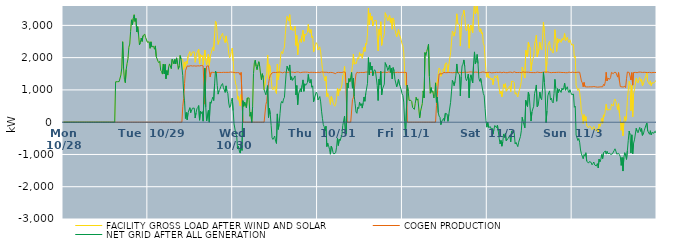
| Category | FACILITY GROSS LOAD AFTER WIND AND SOLAR | COGEN PRODUCTION | NET GRID AFTER ALL GENERATION |
|---|---|---|---|
|  Mon  10/28 | 0 | 0 | 0 |
|  Mon  10/28 | 0 | 0 | 0 |
|  Mon  10/28 | 0 | 0 | 0 |
|  Mon  10/28 | 0 | 0 | 0 |
|  Mon  10/28 | 0 | 0 | 0 |
|  Mon  10/28 | 0 | 0 | 0 |
|  Mon  10/28 | 0 | 0 | 0 |
|  Mon  10/28 | 0 | 0 | 0 |
|  Mon  10/28 | 0 | 0 | 0 |
|  Mon  10/28 | 0 | 0 | 0 |
|  Mon  10/28 | 0 | 0 | 0 |
|  Mon  10/28 | 0 | 0 | 0 |
|  Mon  10/28 | 0 | 0 | 0 |
|  Mon  10/28 | 0 | 0 | 0 |
|  Mon  10/28 | 0 | 0 | 0 |
|  Mon  10/28 | 0 | 0 | 0 |
|  Mon  10/28 | 0 | 0 | 0 |
|  Mon  10/28 | 0 | 0 | 0 |
|  Mon  10/28 | 0 | 0 | 0 |
|  Mon  10/28 | 0 | 0 | 0 |
|  Mon  10/28 | 0 | 0 | 0 |
|  Mon  10/28 | 0 | 0 | 0 |
|  Mon  10/28 | 0 | 0 | 0 |
|  Mon  10/28 | 0 | 0 | 0 |
|  Mon  10/28 | 0 | 0 | 0 |
|  Mon  10/28 | 0 | 0 | 0 |
|  Mon  10/28 | 0 | 0 | 0 |
|  Mon  10/28 | 0 | 0 | 0 |
|  Mon  10/28 | 0 | 0 | 0 |
|  Mon  10/28 | 0 | 0 | 0 |
|  Mon  10/28 | 0 | 0 | 0 |
|  Mon  10/28 | 0 | 0 | 0 |
|  Mon  10/28 | 0 | 0 | 0 |
|  Mon  10/28 | 0 | 0 | 0 |
|  Mon  10/28 | 0 | 0 | 0 |
|  Mon  10/28 | 0 | 0 | 0 |
|  Mon  10/28 | 0 | 0 | 0 |
|  Mon  10/28 | 0 | 0 | 0 |
|  Mon  10/28 | 0 | 0 | 0 |
|  Mon  10/28 | 0 | 0 | 0 |
|  Mon  10/28 | 0 | 0 | 0 |
|  Mon  10/28 | 0 | 0 | 0 |
|  Mon  10/28 | 0 | 0 | 0 |
|  Mon  10/28 | 0 | 0 | 0 |
|  Mon  10/28 | 0 | 0 | 0 |
|  Mon  10/28 | 0 | 0 | 0 |
|  Mon  10/28 | 0 | 0 | 0 |
|  Mon  10/28 | 0 | 0 | 0 |
|  Mon  10/28 | 0 | 0 | 0 |
|  Mon  10/28 | 0 | 0 | 0 |
|  Mon  10/28 | 0 | 0 | 0 |
|  Mon  10/28 | 0 | 0 | 0 |
|  Mon  10/28 | 0 | 0 | 0 |
|  Mon  10/28 | 0 | 0 | 0 |
|  Mon  10/28 | 0 | 0 | 0 |
|  Mon  10/28 | 0 | 0 | 0 |
|  Mon  10/28 | 0 | 0 | 0 |
|  Mon  10/28 | 0 | 0 | 0 |
|  Mon  10/28 | 0 | 0 | 0 |
|  Mon  10/28 | 1250.69 | 0 | 1250.69 |
|  Mon  10/28 | 1252.668 | 0 | 1252.668 |
|  Mon  10/28 | 1254.647 | 0 | 1254.647 |
|  Mon  10/28 | 1256.625 | 0 | 1256.625 |
|  Mon  10/28 | 1258.603 | 0 | 1258.603 |
|  Mon  10/28 | 1260.581 | 0 | 1260.581 |
|  Mon  10/28 | 1464 | 0 | 1464 |
|  Mon  10/28 | 1678 | 0 | 1678 |
|  Mon  10/28 | 2492 | 0 | 2492 |
|  Mon  10/28 | 1679 | 0 | 1679 |
|  Mon  10/28 | 1330 | 0 | 1330 |
|  Mon  10/28 | 1225 | 0 | 1225 |
|  Mon  10/28 | 1632 | 0 | 1632 |
|  Mon  10/28 | 1819 | 0 | 1819 |
|  Mon  10/28 | 1964 | 0 | 1964 |
|  Mon  10/28 | 2321 | 0 | 2321 |
|  Mon  10/28 | 2421 | 0 | 2421 |
|  Mon  10/28 | 2817 | 0 | 2817 |
|  Mon  10/28 | 3172 | 0 | 3172 |
|  Mon  10/28 | 3016 | 0 | 3016 |
|  Mon  10/28 | 3217 | 0 | 3217 |
|  Mon  10/28 | 3328 | 0 | 3328 |
|  Mon  10/28 | 3123 | 0 | 3123 |
|  Mon  10/28 | 3212 | 0 | 3212 |
|  Mon  10/28 | 2795 | 0 | 2795 |
|  Mon  10/28 | 2959 | 0 | 2959 |
|  Mon  10/28 | 2708 | 0 | 2708 |
|  Mon  10/28 | 2396 | 0 | 2396 |
|  Mon  10/28 | 2468 | 0 | 2468 |
|  Mon  10/28 | 2608 | 0 | 2608 |
|  Mon  10/28 | 2502 | 0 | 2502 |
|  Mon  10/28 | 2678 | 0 | 2678 |
|  Mon  10/28 | 2668 | 0 | 2668 |
|  Mon  10/28 | 2727 | 0 | 2727 |
|  Mon  10/28 | 2619 | 0 | 2619 |
|  Mon  10/28 | 2647 | 0 | 2647 |
|  Mon  10/28 | 2477 | 0 | 2477 |
|  Tue  10/29 | 2494 | 0 | 2494 |
|  Tue  10/29 | 2489 | 0 | 2489 |
|  Tue  10/29 | 2289 | 0 | 2289 |
|  Tue  10/29 | 2490 | 0 | 2490 |
|  Tue  10/29 | 2333 | 0 | 2333 |
|  Tue  10/29 | 2355 | 0 | 2355 |
|  Tue  10/29 | 2350 | 0 | 2350 |
|  Tue  10/29 | 2260 | 0 | 2260 |
|  Tue  10/29 | 2363 | 0 | 2363 |
|  Tue  10/29 | 2029 | 0 | 2029 |
|  Tue  10/29 | 2006 | 0 | 2006 |
|  Tue  10/29 | 1885 | 0 | 1885 |
|  Tue  10/29 | 1843 | 0 | 1843 |
|  Tue  10/29 | 1887 | 0 | 1887 |
|  Tue  10/29 | 1609 | 0 | 1609 |
|  Tue  10/29 | 1569 | 0 | 1569 |
|  Tue  10/29 | 1491 | 0 | 1491 |
|  Tue  10/29 | 1799 | 0 | 1799 |
|  Tue  10/29 | 1496 | 0 | 1496 |
|  Tue  10/29 | 1792 | 0 | 1792 |
|  Tue  10/29 | 1344 | 0 | 1344 |
|  Tue  10/29 | 1599 | 0 | 1599 |
|  Tue  10/29 | 1460 | 0 | 1460 |
|  Tue  10/29 | 1702 | 0 | 1702 |
|  Tue  10/29 | 1806 | 0 | 1806 |
|  Tue  10/29 | 1835 | 0 | 1835 |
|  Tue  10/29 | 1660 | 0 | 1660 |
|  Tue  10/29 | 1951 | 0 | 1951 |
|  Tue  10/29 | 1907 | 0 | 1907 |
|  Tue  10/29 | 1805 | 0 | 1805 |
|  Tue  10/29 | 1944 | 0 | 1944 |
|  Tue  10/29 | 1803 | 0 | 1803 |
|  Tue  10/29 | 1992 | 0 | 1992 |
|  Tue  10/29 | 1834 | 0 | 1834 |
|  Tue  10/29 | 1642 | 0 | 1642 |
|  Tue  10/29 | 1744 | 0 | 1744 |
|  Tue  10/29 | 2065 | 0 | 2065 |
|  Tue  10/29 | 1953 | 0 | 1953 |
|  Tue  10/29 | 1929 | 0 | 1929 |
|  Tue  10/29 | 1933 | 489 | 1444 |
|  Tue  10/29 | 1636 | 735 | 901 |
|  Tue  10/29 | 1860 | 1198 | 662 |
|  Tue  10/29 | 1705 | 1590 | 115 |
|  Tue  10/29 | 1895 | 1595 | 300 |
|  Tue  10/29 | 1816 | 1742 | 74 |
|  Tue  10/29 | 2051 | 1756 | 295 |
|  Tue  10/29 | 2027 | 1734 | 293 |
|  Tue  10/29 | 2186 | 1737 | 449 |
|  Tue  10/29 | 2044 | 1751 | 293 |
|  Tue  10/29 | 2050 | 1740 | 310 |
|  Tue  10/29 | 2173 | 1739 | 434 |
|  Tue  10/29 | 2172 | 1743 | 429 |
|  Tue  10/29 | 2182 | 1746 | 436 |
|  Tue  10/29 | 1855 | 1726 | 129 |
|  Tue  10/29 | 2025 | 1737 | 288 |
|  Tue  10/29 | 2149 | 1732 | 417 |
|  Tue  10/29 | 2203 | 1747 | 456 |
|  Tue  10/29 | 2267 | 1752 | 515 |
|  Tue  10/29 | 1802 | 1742 | 60 |
|  Tue  10/29 | 2095 | 1760 | 335 |
|  Tue  10/29 | 2027 | 1756 | 271 |
|  Tue  10/29 | 2067 | 1739 | 328 |
|  Tue  10/29 | 1775 | 1745 | 30 |
|  Tue  10/29 | 1770 | 1753 | 17 |
|  Tue  10/29 | 2231 | 559 | 1672 |
|  Tue  10/29 | 1923 | 1451 | 472 |
|  Tue  10/29 | 1774 | 1737 | 37 |
|  Tue  10/29 | 1799 | 1757 | 42 |
|  Tue  10/29 | 2109 | 1747 | 362 |
|  Tue  10/29 | 1754 | 1753 | 1 |
|  Tue  10/29 | 2029 | 1401 | 628 |
|  Tue  10/29 | 2128 | 1544 | 584 |
|  Tue  10/29 | 2241 | 1547 | 694 |
|  Tue  10/29 | 2320 | 1544 | 776 |
|  Tue  10/29 | 2215 | 1545 | 670 |
|  Tue  10/29 | 2725 | 1539 | 1186 |
|  Tue  10/29 | 3131 | 1547 | 1584 |
|  Tue  10/29 | 3054 | 1539 | 1515 |
|  Tue  10/29 | 2700 | 1559 | 1141 |
|  Tue  10/29 | 2410 | 1541 | 869 |
|  Tue  10/29 | 2518 | 1545 | 973 |
|  Tue  10/29 | 2560 | 1541 | 1019 |
|  Tue  10/29 | 2643 | 1539 | 1104 |
|  Tue  10/29 | 2702 | 1539 | 1163 |
|  Tue  10/29 | 2756 | 1559 | 1197 |
|  Tue  10/29 | 2614 | 1545 | 1069 |
|  Tue  10/29 | 2623 | 1552 | 1071 |
|  Tue  10/29 | 2464 | 1542 | 922 |
|  Tue  10/29 | 2672 | 1547 | 1125 |
|  Tue  10/29 | 2498 | 1544 | 954 |
|  Tue  10/29 | 2434 | 1549 | 885 |
|  Tue  10/29 | 2136 | 1542 | 594 |
|  Tue  10/29 | 2000 | 1546 | 454 |
|  Tue  10/29 | 2046 | 1553 | 493 |
|  Tue  10/29 | 2191 | 1548 | 643 |
|  Tue  10/29 | 2297 | 1549 | 748 |
|  Wed  10/30 | 1897 | 1540 | 357 |
|  Wed  10/30 | 1490 | 1543 | -53 |
|  Wed  10/30 | 1494 | 1542 | -48 |
|  Wed  10/30 | 1172 | 1532 | -360 |
|  Wed  10/30 | 1110 | 1540 | -430 |
|  Wed  10/30 | 711 | 1537 | -826 |
|  Wed  10/30 | 799 | 1548 | -749 |
|  Wed  10/30 | 634 | 1528 | -894 |
|  Wed  10/30 | 501 | 1459 | -958 |
|  Wed  10/30 | 855 | 1542 | -687 |
|  Wed  10/30 | 673 | 1548 | -875 |
|  Wed  10/30 | 667 | 0 | 667 |
|  Wed  10/30 | 492 | 0 | 492 |
|  Wed  10/30 | 624 | 0 | 624 |
|  Wed  10/30 | 518 | 0 | 518 |
|  Wed  10/30 | 444 | 0 | 444 |
|  Wed  10/30 | 750 | 0 | 750 |
|  Wed  10/30 | 768 | 0 | 768 |
|  Wed  10/30 | 751 | 0 | 751 |
|  Wed  10/30 | 184 | 0 | 184 |
|  Wed  10/30 | 306 | 0 | 306 |
|  Wed  10/30 | -13 | 0 | -13 |
|  Wed  10/30 | 480 | 0 | 480 |
|  Wed  10/30 | 1505 | 0 | 1505 |
|  Wed  10/30 | 1840 | 0 | 1840 |
|  Wed  10/30 | 1920 | 0 | 1920 |
|  Wed  10/30 | 1736 | 0 | 1736 |
|  Wed  10/30 | 1628 | 0 | 1628 |
|  Wed  10/30 | 1775 | 0 | 1775 |
|  Wed  10/30 | 1873 | 0 | 1873 |
|  Wed  10/30 | 1734 | 0 | 1734 |
|  Wed  10/30 | 1495 | 0 | 1495 |
|  Wed  10/30 | 1309 | 0 | 1309 |
|  Wed  10/30 | 1502 | 0 | 1502 |
|  Wed  10/30 | 1384 | 0 | 1384 |
|  Wed  10/30 | 1005 | 0 | 1005 |
|  Wed  10/30 | 1014 | 0 | 1014 |
|  Wed  10/30 | 1395 | 547 | 848 |
|  Wed  10/30 | 1506 | 648 | 858 |
|  Wed  10/30 | 2082 | 949 | 1133 |
|  Wed  10/30 | 1337 | 1192 | 145 |
|  Wed  10/30 | 1783 | 1353 | 430 |
|  Wed  10/30 | 1691 | 1452 | 239 |
|  Wed  10/30 | 1345 | 1453 | -108 |
|  Wed  10/30 | 1043 | 1528 | -485 |
|  Wed  10/30 | 1005 | 1540 | -535 |
|  Wed  10/30 | 1062 | 1543 | -481 |
|  Wed  10/30 | 1109 | 1538 | -429 |
|  Wed  10/30 | 948 | 1539 | -591 |
|  Wed  10/30 | 887 | 1547 | -660 |
|  Wed  10/30 | 1800 | 1544 | 256 |
|  Wed  10/30 | 1309 | 1534 | -225 |
|  Wed  10/30 | 1489 | 1552 | -63 |
|  Wed  10/30 | 1809 | 1545 | 264 |
|  Wed  10/30 | 2128 | 1548 | 580 |
|  Wed  10/30 | 2188 | 1544 | 644 |
|  Wed  10/30 | 2120 | 1529 | 591 |
|  Wed  10/30 | 2251 | 1533 | 718 |
|  Wed  10/30 | 2321 | 1553 | 768 |
|  Wed  10/30 | 2711 | 1556 | 1155 |
|  Wed  10/30 | 3068 | 1539 | 1529 |
|  Wed  10/30 | 3279 | 1544 | 1735 |
|  Wed  10/30 | 3269 | 1544 | 1725 |
|  Wed  10/30 | 3138 | 1541 | 1597 |
|  Wed  10/30 | 3329 | 1555 | 1774 |
|  Wed  10/30 | 2866 | 1554 | 1312 |
|  Wed  10/30 | 2957 | 1550 | 1407 |
|  Wed  10/30 | 2847 | 1551 | 1296 |
|  Wed  10/30 | 2876 | 1548 | 1328 |
|  Wed  10/30 | 2863 | 1526 | 1337 |
|  Wed  10/30 | 2971 | 1538 | 1433 |
|  Wed  10/30 | 2377 | 1533 | 844 |
|  Wed  10/30 | 2691 | 1555 | 1136 |
|  Wed  10/30 | 2092 | 1552 | 540 |
|  Wed  10/30 | 2426 | 1552 | 874 |
|  Wed  10/30 | 2401 | 1541 | 860 |
|  Wed  10/30 | 2577 | 1535 | 1042 |
|  Wed  10/30 | 2474 | 1539 | 935 |
|  Wed  10/30 | 2688 | 1545 | 1143 |
|  Wed  10/30 | 2849 | 1539 | 1310 |
|  Wed  10/30 | 2506 | 1550 | 956 |
|  Wed  10/30 | 2727 | 1537 | 1190 |
|  Wed  10/30 | 2693 | 1550 | 1143 |
|  Wed  10/30 | 2723 | 1546 | 1177 |
|  Wed  10/30 | 2778 | 1548 | 1230 |
|  Wed  10/30 | 3030 | 1551 | 1479 |
|  Wed  10/30 | 2799 | 1537 | 1262 |
|  Wed  10/30 | 2759 | 1546 | 1213 |
|  Wed  10/30 | 2873 | 1547 | 1326 |
|  Wed  10/30 | 2620 | 1537 | 1083 |
|  Wed  10/30 | 2668 | 1543 | 1125 |
|  Wed  10/30 | 2177 | 1544 | 633 |
|  Wed  10/30 | 2294 | 1543 | 751 |
|  Wed  10/30 | 2291 | 1542 | 749 |
|  Wed  10/30 | 2465 | 1536 | 929 |
|  Wed  10/30 | 2417 | 1538 | 879 |
|  Thu  10/31 | 2235 | 1548 | 687 |
|  Thu  10/31 | 2232 | 1551 | 681 |
|  Thu  10/31 | 2335 | 1540 | 795 |
|  Thu  10/31 | 2177 | 1548 | 629 |
|  Thu  10/31 | 1894 | 1553 | 341 |
|  Thu  10/31 | 1661 | 1541 | 120 |
|  Thu  10/31 | 1473 | 1550 | -77 |
|  Thu  10/31 | 1394 | 1536 | -142 |
|  Thu  10/31 | 1276 | 1546 | -270 |
|  Thu  10/31 | 1419 | 1546 | -127 |
|  Thu  10/31 | 791 | 1546 | -755 |
|  Thu  10/31 | 892 | 1540 | -648 |
|  Thu  10/31 | 799 | 1534 | -735 |
|  Thu  10/31 | 706 | 1546 | -840 |
|  Thu  10/31 | 550 | 1542 | -992 |
|  Thu  10/31 | 793 | 1536 | -743 |
|  Thu  10/31 | 719 | 1539 | -820 |
|  Thu  10/31 | 603 | 1541 | -938 |
|  Thu  10/31 | 538 | 1523 | -985 |
|  Thu  10/31 | 494 | 1506 | -1012 |
|  Thu  10/31 | 558 | 1502 | -944 |
|  Thu  10/31 | 762 | 1537 | -775 |
|  Thu  10/31 | 1053 | 1551 | -498 |
|  Thu  10/31 | 822 | 1544 | -722 |
|  Thu  10/31 | 1031 | 1561 | -530 |
|  Thu  10/31 | 969 | 1541 | -572 |
|  Thu  10/31 | 981 | 1534 | -553 |
|  Thu  10/31 | 1149 | 1540 | -391 |
|  Thu  10/31 | 1447 | 1550 | -103 |
|  Thu  10/31 | 1483 | 1556 | -73 |
|  Thu  10/31 | 1729 | 1540 | 189 |
|  Thu  10/31 | 1254 | 1547 | -293 |
|  Thu  10/31 | 1172 | 1532 | -360 |
|  Thu  10/31 | 1215 | 0 | 1215 |
|  Thu  10/31 | 1062 | 0 | 1062 |
|  Thu  10/31 | 1351 | 0 | 1351 |
|  Thu  10/31 | 1259 | 0 | 1259 |
|  Thu  10/31 | 1381 | 0 | 1381 |
|  Thu  10/31 | 1539 | 0 | 1539 |
|  Thu  10/31 | 1757 | 703 | 1054 |
|  Thu  10/31 | 2112 | 754 | 1358 |
|  Thu  10/31 | 1795 | 996 | 799 |
|  Thu  10/31 | 1847 | 1275 | 572 |
|  Thu  10/31 | 1807 | 1493 | 314 |
|  Thu  10/31 | 1821 | 1546 | 275 |
|  Thu  10/31 | 2002 | 1537 | 465 |
|  Thu  10/31 | 1954 | 1532 | 422 |
|  Thu  10/31 | 2156 | 1539 | 617 |
|  Thu  10/31 | 2059 | 1540 | 519 |
|  Thu  10/31 | 2116 | 1544 | 572 |
|  Thu  10/31 | 1977 | 1540 | 437 |
|  Thu  10/31 | 2132 | 1542 | 590 |
|  Thu  10/31 | 2317 | 1538 | 779 |
|  Thu  10/31 | 2191 | 1543 | 648 |
|  Thu  10/31 | 2442 | 1551 | 891 |
|  Thu  10/31 | 2409 | 1535 | 874 |
|  Thu  10/31 | 2757 | 1553 | 1204 |
|  Thu  10/31 | 3534 | 1533 | 2001 |
|  Thu  10/31 | 3016 | 1548 | 1468 |
|  Thu  10/31 | 3384 | 1536 | 1848 |
|  Thu  10/31 | 3165 | 1543 | 1622 |
|  Thu  10/31 | 3277 | 1538 | 1739 |
|  Thu  10/31 | 2989 | 1548 | 1441 |
|  Thu  10/31 | 3099 | 1532 | 1567 |
|  Thu  10/31 | 3156 | 1530 | 1626 |
|  Thu  10/31 | 3127 | 1545 | 1582 |
|  Thu  10/31 | 3151 | 1543 | 1608 |
|  Thu  10/31 | 2667 | 1536 | 1131 |
|  Thu  10/31 | 2214 | 1543 | 671 |
|  Thu  10/31 | 2880 | 1544 | 1336 |
|  Thu  10/31 | 2696 | 1539 | 1157 |
|  Thu  10/31 | 3111 | 1538 | 1573 |
|  Thu  10/31 | 2381 | 1537 | 844 |
|  Thu  10/31 | 2572 | 1538 | 1034 |
|  Thu  10/31 | 2599 | 1548 | 1051 |
|  Thu  10/31 | 2715 | 1537 | 1178 |
|  Thu  10/31 | 3392 | 1547 | 1845 |
|  Thu  10/31 | 3413 | 1542 | 1871 |
|  Thu  10/31 | 3244 | 1538 | 1706 |
|  Thu  10/31 | 3144 | 1544 | 1600 |
|  Thu  10/31 | 3241 | 1558 | 1683 |
|  Thu  10/31 | 3308 | 1538 | 1770 |
|  Thu  10/31 | 3085 | 1539 | 1546 |
|  Thu  10/31 | 3215 | 1546 | 1669 |
|  Thu  10/31 | 2880 | 1540 | 1340 |
|  Thu  10/31 | 3230 | 1539 | 1691 |
|  Thu  10/31 | 3138 | 1541 | 1597 |
|  Thu  10/31 | 2871 | 1541 | 1330 |
|  Thu  10/31 | 2863 | 1540 | 1323 |
|  Thu  10/31 | 2647 | 1550 | 1097 |
|  Thu  10/31 | 2752 | 1546 | 1206 |
|  Thu  10/31 | 2873 | 1540 | 1333 |
|  Thu  10/31 | 2725 | 1541 | 1184 |
|  Thu  10/31 | 2647 | 1543 | 1104 |
|  Thu  10/31 | 2556 | 1542 | 1014 |
|  Thu  10/31 | 2428 | 1544 | 884 |
|  Fri  11/1 | 2370 | 1545 | 825 |
|  Fri  11/1 | 2168 | 1545 | 623 |
|  Fri  11/1 | 1554 | 1542 | 12 |
|  Fri  11/1 | 1145 | 1545 | -400 |
|  Fri  11/1 | 1159 | 1539 | -380 |
|  Fri  11/1 | 1149 | 0 | 1149 |
|  Fri  11/1 | 967 | 0 | 967 |
|  Fri  11/1 | 675 | 0 | 675 |
|  Fri  11/1 | 692 | 0 | 692 |
|  Fri  11/1 | 677 | 0 | 677 |
|  Fri  11/1 | 641 | 0 | 641 |
|  Fri  11/1 | 456 | 0 | 456 |
|  Fri  11/1 | 472 | 0 | 472 |
|  Fri  11/1 | 396 | 0 | 396 |
|  Fri  11/1 | 576 | 0 | 576 |
|  Fri  11/1 | 769 | 0 | 769 |
|  Fri  11/1 | 682 | 0 | 682 |
|  Fri  11/1 | 724 | 0 | 724 |
|  Fri  11/1 | 718 | 0 | 718 |
|  Fri  11/1 | 134 | 0 | 134 |
|  Fri  11/1 | 337 | 0 | 337 |
|  Fri  11/1 | 329 | 0 | 329 |
|  Fri  11/1 | 576 | 0 | 576 |
|  Fri  11/1 | 968 | 0 | 968 |
|  Fri  11/1 | 752 | 0 | 752 |
|  Fri  11/1 | 2155 | 0 | 2155 |
|  Fri  11/1 | 2071 | 0 | 2071 |
|  Fri  11/1 | 2187 | 0 | 2187 |
|  Fri  11/1 | 2295 | 0 | 2295 |
|  Fri  11/1 | 2417 | 0 | 2417 |
|  Fri  11/1 | 1418 | 0 | 1418 |
|  Fri  11/1 | 896 | 0 | 896 |
|  Fri  11/1 | 1070 | 0 | 1070 |
|  Fri  11/1 | 926 | 0 | 926 |
|  Fri  11/1 | 957 | 0 | 957 |
|  Fri  11/1 | 749 | 0 | 749 |
|  Fri  11/1 | 797 | 0 | 797 |
|  Fri  11/1 | 1218 | 0 | 1218 |
|  Fri  11/1 | 1125 | 511 | 614 |
|  Fri  11/1 | 1262 | 486 | 776 |
|  Fri  11/1 | 1504 | 1210 | 294 |
|  Fri  11/1 | 1680 | 1493 | 187 |
|  Fri  11/1 | 1636 | 1487 | 149 |
|  Fri  11/1 | 1422 | 1499 | -77 |
|  Fri  11/1 | 1519 | 1491 | 28 |
|  Fri  11/1 | 1571 | 1499 | 72 |
|  Fri  11/1 | 1662 | 1544 | 118 |
|  Fri  11/1 | 1566 | 1535 | 31 |
|  Fri  11/1 | 1810 | 1535 | 275 |
|  Fri  11/1 | 1843 | 1550 | 293 |
|  Fri  11/1 | 1786 | 1535 | 251 |
|  Fri  11/1 | 1556 | 1530 | 26 |
|  Fri  11/1 | 1784 | 1542 | 242 |
|  Fri  11/1 | 1809 | 1547 | 262 |
|  Fri  11/1 | 2151 | 1537 | 614 |
|  Fri  11/1 | 2480 | 1540 | 940 |
|  Fri  11/1 | 2826 | 1533 | 1293 |
|  Fri  11/1 | 2769 | 1541 | 1228 |
|  Fri  11/1 | 2667 | 1536 | 1131 |
|  Fri  11/1 | 2800 | 1538 | 1262 |
|  Fri  11/1 | 3000 | 1544 | 1456 |
|  Fri  11/1 | 3357 | 1553 | 1804 |
|  Fri  11/1 | 3058 | 1535 | 1523 |
|  Fri  11/1 | 3063 | 1545 | 1518 |
|  Fri  11/1 | 3023 | 1548 | 1475 |
|  Fri  11/1 | 2359 | 1544 | 815 |
|  Fri  11/1 | 2952 | 1538 | 1414 |
|  Fri  11/1 | 3290 | 1546 | 1744 |
|  Fri  11/1 | 3339 | 1541 | 1798 |
|  Fri  11/1 | 3471 | 1542 | 1929 |
|  Fri  11/1 | 3274 | 1549 | 1725 |
|  Fri  11/1 | 2902 | 1544 | 1358 |
|  Fri  11/1 | 2831 | 1544 | 1287 |
|  Fri  11/1 | 2904 | 1541 | 1363 |
|  Fri  11/1 | 3038 | 1547 | 1491 |
|  Fri  11/1 | 2292 | 1537 | 755 |
|  Fri  11/1 | 2914 | 1557 | 1357 |
|  Fri  11/1 | 3011 | 1543 | 1468 |
|  Fri  11/1 | 3001 | 1553 | 1448 |
|  Fri  11/1 | 2772 | 1552 | 1220 |
|  Fri  11/1 | 3363 | 1544 | 1819 |
|  Fri  11/1 | 3714 | 1536 | 2178 |
|  Fri  11/1 | 3352 | 1550 | 1802 |
|  Fri  11/1 | 3439 | 1538 | 1901 |
|  Fri  11/1 | 3649 | 1549 | 2100 |
|  Fri  11/1 | 3354 | 1539 | 1815 |
|  Fri  11/1 | 2890 | 1529 | 1361 |
|  Fri  11/1 | 2799 | 1533 | 1266 |
|  Fri  11/1 | 2897 | 1541 | 1356 |
|  Fri  11/1 | 2740 | 1543 | 1197 |
|  Fri  11/1 | 2776 | 1554 | 1222 |
|  Fri  11/1 | 2440 | 1549 | 891 |
|  Fri  11/1 | 2372 | 1552 | 820 |
|  Fri  11/1 | 1975 | 1545 | 430 |
|  Fri  11/1 | 1587 | 1531 | 56 |
|  Fri  11/1 | 1391 | 1545 | -154 |
|  Sat  11/2 | 1539 | 1542 | -3 |
|  Sat  11/2 | 1367 | 1530 | -163 |
|  Sat  11/2 | 1408 | 1548 | -140 |
|  Sat  11/2 | 1389 | 1529 | -140 |
|  Sat  11/2 | 1309 | 1530 | -221 |
|  Sat  11/2 | 1366 | 1549 | -183 |
|  Sat  11/2 | 1160 | 1532 | -372 |
|  Sat  11/2 | 1319 | 1544 | -225 |
|  Sat  11/2 | 1436 | 1538 | -102 |
|  Sat  11/2 | 1443 | 1534 | -91 |
|  Sat  11/2 | 1374 | 1545 | -171 |
|  Sat  11/2 | 1445 | 1536 | -91 |
|  Sat  11/2 | 1250 | 1540 | -290 |
|  Sat  11/2 | 1038 | 1549 | -511 |
|  Sat  11/2 | 876 | 1550 | -674 |
|  Sat  11/2 | 963 | 1528 | -565 |
|  Sat  11/2 | 788 | 1532 | -744 |
|  Sat  11/2 | 935 | 1545 | -610 |
|  Sat  11/2 | 1184 | 1549 | -365 |
|  Sat  11/2 | 1083 | 1539 | -456 |
|  Sat  11/2 | 1192 | 1537 | -345 |
|  Sat  11/2 | 957 | 1538 | -581 |
|  Sat  11/2 | 928 | 1533 | -605 |
|  Sat  11/2 | 1031 | 1533 | -502 |
|  Sat  11/2 | 1028 | 1548 | -520 |
|  Sat  11/2 | 1123 | 1540 | -417 |
|  Sat  11/2 | 939 | 1550 | -611 |
|  Sat  11/2 | 1270 | 1546 | -276 |
|  Sat  11/2 | 1282 | 1535 | -253 |
|  Sat  11/2 | 1260 | 1542 | -282 |
|  Sat  11/2 | 1224 | 1561 | -337 |
|  Sat  11/2 | 867 | 1541 | -674 |
|  Sat  11/2 | 913 | 1538 | -625 |
|  Sat  11/2 | 922 | 1545 | -623 |
|  Sat  11/2 | 781 | 1539 | -758 |
|  Sat  11/2 | 921 | 1542 | -621 |
|  Sat  11/2 | 910 | 1542 | -632 |
|  Sat  11/2 | 1105 | 1549 | -444 |
|  Sat  11/2 | 1269 | 1535 | -266 |
|  Sat  11/2 | 1706 | 1555 | 151 |
|  Sat  11/2 | 1582 | 1559 | 23 |
|  Sat  11/2 | 1582 | 1545 | 37 |
|  Sat  11/2 | 1369 | 1545 | -176 |
|  Sat  11/2 | 2233 | 1554 | 679 |
|  Sat  11/2 | 2214 | 1550 | 664 |
|  Sat  11/2 | 2024 | 1540 | 484 |
|  Sat  11/2 | 2478 | 1548 | 930 |
|  Sat  11/2 | 2358 | 1549 | 809 |
|  Sat  11/2 | 2323 | 1541 | 782 |
|  Sat  11/2 | 1587 | 1552 | 35 |
|  Sat  11/2 | 1854 | 1537 | 317 |
|  Sat  11/2 | 1952 | 1544 | 408 |
|  Sat  11/2 | 2031 | 1537 | 494 |
|  Sat  11/2 | 2439 | 1547 | 892 |
|  Sat  11/2 | 2533 | 1535 | 998 |
|  Sat  11/2 | 2694 | 1541 | 1153 |
|  Sat  11/2 | 2026 | 1552 | 474 |
|  Sat  11/2 | 2055 | 1543 | 512 |
|  Sat  11/2 | 2261 | 1542 | 719 |
|  Sat  11/2 | 2476 | 1545 | 931 |
|  Sat  11/2 | 2287 | 1537 | 750 |
|  Sat  11/2 | 2236 | 1541 | 695 |
|  Sat  11/2 | 2573 | 1545 | 1028 |
|  Sat  11/2 | 3103 | 1548 | 1555 |
|  Sat  11/2 | 2794 | 1554 | 1240 |
|  Sat  11/2 | 2475 | 1535 | 940 |
|  Sat  11/2 | 1534 | 1548 | -14 |
|  Sat  11/2 | 1878 | 1532 | 346 |
|  Sat  11/2 | 2368 | 1555 | 813 |
|  Sat  11/2 | 2456 | 1542 | 914 |
|  Sat  11/2 | 2510 | 1541 | 969 |
|  Sat  11/2 | 2229 | 1540 | 689 |
|  Sat  11/2 | 2278 | 1534 | 744 |
|  Sat  11/2 | 2179 | 1543 | 636 |
|  Sat  11/2 | 2140 | 1542 | 598 |
|  Sat  11/2 | 2435 | 1547 | 888 |
|  Sat  11/2 | 2865 | 1539 | 1326 |
|  Sat  11/2 | 2585 | 1545 | 1040 |
|  Sat  11/2 | 2191 | 1543 | 648 |
|  Sat  11/2 | 2590 | 1552 | 1038 |
|  Sat  11/2 | 2464 | 1546 | 918 |
|  Sat  11/2 | 2573 | 1553 | 1020 |
|  Sat  11/2 | 2559 | 1545 | 1014 |
|  Sat  11/2 | 2470 | 1548 | 922 |
|  Sat  11/2 | 2594 | 1539 | 1055 |
|  Sat  11/2 | 2535 | 1542 | 993 |
|  Sat  11/2 | 2611 | 1540 | 1071 |
|  Sat  11/2 | 2748 | 1539 | 1209 |
|  Sat  11/2 | 2522 | 1534 | 988 |
|  Sat  11/2 | 2532 | 1536 | 996 |
|  Sat  11/2 | 2631 | 1533 | 1098 |
|  Sat  11/2 | 2518 | 1548 | 970 |
|  Sat  11/2 | 2469 | 1552 | 917 |
|  Sat  11/2 | 2555 | 1544 | 1011 |
|  Sat  11/2 | 2459 | 1538 | 921 |
|  Sat  11/2 | 2389 | 1536 | 853 |
|  Sun  11/3 | 2419 | 1551 | 868 |
|  Sun  11/3 | 2404 | 1535 | 869 |
|  Sun  11/3 | 2001 | 1539 | 462 |
|  Sun  11/3 | 2048 | 1553 | 495 |
|  Sun  11/3 | 1144 | 1541 | -397 |
|  Sun  11/3 | 1130 | 1546 | -416 |
|  Sun  11/3 | 981 | 1548 | -567 |
|  Sun  11/3 | 1044 | 1549 | -505 |
|  Sun  11/3 | 927 | 1548 | -621 |
|  Sun  11/3 | 678 | 1541 | -863 |
|  Sun  11/3 | 298 | 1278 | -980 |
|  Sun  11/3 | 215 | 1218 | -1003 |
|  Sun  11/3 | -38 | 1098 | -1136 |
|  Sun  11/3 | 233 | 1231 | -998 |
|  Sun  11/3 | 46 | 1100 | -1054 |
|  Sun  11/3 | 175 | 1122 | -947 |
|  Sun  11/3 | -114 | 1092 | -1206 |
|  Sun  11/3 | -104 | 1092 | -1196 |
|  Sun  11/3 | -176 | 1093 | -1269 |
|  Sun  11/3 | -124 | 1097 | -1221 |
|  Sun  11/3 | -107 | 1096 | -1203 |
|  Sun  11/3 | -153 | 1092 | -1245 |
|  Sun  11/3 | -227 | 1094 | -1321 |
|  Sun  11/3 | -193 | 1088 | -1281 |
|  Sun  11/3 | -129 | 1105 | -1234 |
|  Sun  11/3 | -216 | 1109 | -1325 |
|  Sun  11/3 | -258 | 1095 | -1353 |
|  Sun  11/3 | -260 | 1096 | -1356 |
|  Sun  11/3 | -196 | 1086 | -1282 |
|  Sun  11/3 | -326 | 1094 | -1420 |
|  Sun  11/3 | -55 | 1090 | -1145 |
|  Sun  11/3 | -131 | 1097 | -1228 |
|  Sun  11/3 | -51 | 1096 | -1147 |
|  Sun  11/3 | 123 | 1126 | -1003 |
|  Sun  11/3 | -33 | 1095 | -1128 |
|  Sun  11/3 | 228 | 1172 | -944 |
|  Sun  11/3 | 178 | 1131 | -953 |
|  Sun  11/3 | 360 | 1252 | -892 |
|  Sun  11/3 | 555 | 1546 | -991 |
|  Sun  11/3 | 378 | 1276 | -898 |
|  Sun  11/3 | 378 | 1357 | -979 |
|  Sun  11/3 | 385 | 1347 | -962 |
|  Sun  11/3 | 372 | 1331 | -959 |
|  Sun  11/3 | 387 | 1386 | -999 |
|  Sun  11/3 | 566 | 1543 | -977 |
|  Sun  11/3 | 549 | 1531 | -982 |
|  Sun  11/3 | 496 | 1502 | -1006 |
|  Sun  11/3 | 662 | 1542 | -880 |
|  Sun  11/3 | 719 | 1544 | -825 |
|  Sun  11/3 | 643 | 1541 | -898 |
|  Sun  11/3 | 521 | 1511 | -990 |
|  Sun  11/3 | 389 | 1396 | -1007 |
|  Sun  11/3 | 573 | 1538 | -965 |
|  Sun  11/3 | 271 | 1282 | -1011 |
|  Sun  11/3 | 30 | 1104 | -1074 |
|  Sun  11/3 | -252 | 1088 | -1340 |
|  Sun  11/3 | 0 | 1093 | -1093 |
|  Sun  11/3 | -420 | 1094 | -1514 |
|  Sun  11/3 | -1 | 1091 | -1092 |
|  Sun  11/3 | 177 | 1123 | -946 |
|  Sun  11/3 | 28 | 1070 | -1042 |
|  Sun  11/3 | 191 | 1346 | -1155 |
|  Sun  11/3 | 675 | 1555 | -880 |
|  Sun  11/3 | 992 | 1553 | -561 |
|  Sun  11/3 | 1266 | 1541 | -275 |
|  Sun  11/3 | 1154 | 1543 | -389 |
|  Sun  11/3 | 354 | 1308 | -954 |
|  Sun  11/3 | 1146 | 1537 | -391 |
|  Sun  11/3 | 168 | 1148 | -980 |
|  Sun  11/3 | 884 | 1539 | -655 |
|  Sun  11/3 | 1002 | 1549 | -547 |
|  Sun  11/3 | 1002 | 1542 | -540 |
|  Sun  11/3 | 1362 | 1551 | -189 |
|  Sun  11/3 | 1256 | 1534 | -278 |
|  Sun  11/3 | 1212 | 1540 | -328 |
|  Sun  11/3 | 1311 | 1552 | -241 |
|  Sun  11/3 | 1389 | 1550 | -161 |
|  Sun  11/3 | 1266 | 1551 | -285 |
|  Sun  11/3 | 1336 | 1532 | -196 |
|  Sun  11/3 | 1129 | 1541 | -412 |
|  Sun  11/3 | 1163 | 1535 | -372 |
|  Sun  11/3 | 1280 | 1547 | -267 |
|  Sun  11/3 | 1259 | 1530 | -271 |
|  Sun  11/3 | 1450 | 1541 | -91 |
|  Sun  11/3 | 1515 | 1542 | -27 |
|  Sun  11/3 | 1266 | 1537 | -271 |
|  Sun  11/3 | 1244 | 1539 | -295 |
|  Sun  11/3 | 1170 | 1544 | -374 |
|  Sun  11/3 | 1279 | 1544 | -265 |
|  Sun  11/3 | 1136 | 1533 | -397 |
|  Sun  11/3 | 1218 | 1536 | -318 |
|  Sun  11/3 | 1192 | 1539 | -347 |
|  Sun  11/3 | 1214 | 1556 | -342 |
|  Sun  11/3 | 1252 | 1540 | -288 |
|  Sun  11/3 | 1224 | 1545 | -321 |
|  Sun  11/3 | 1305 | 1540 | -235 |